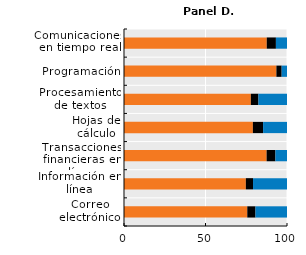
| Category | Nunca  | Menos de una vez por semana | Al menos una vez por semana |
|---|---|---|---|
| Correo electrónico | 75.631 | 5.04 | 19.329 |
| Información en línea | 74.756 | 4.405 | 20.839 |
| Transacciones financieras en línea | 87.491 | 5.417 | 7.091 |
| Hojas de cálculo | 79.069 | 6.272 | 14.66 |
| Procesamiento de textos | 77.826 | 4.655 | 17.519 |
| Programación | 93.495 | 3.233 | 3.272 |
| Comunicaciones en tiempo real | 87.583 | 5.613 | 6.804 |